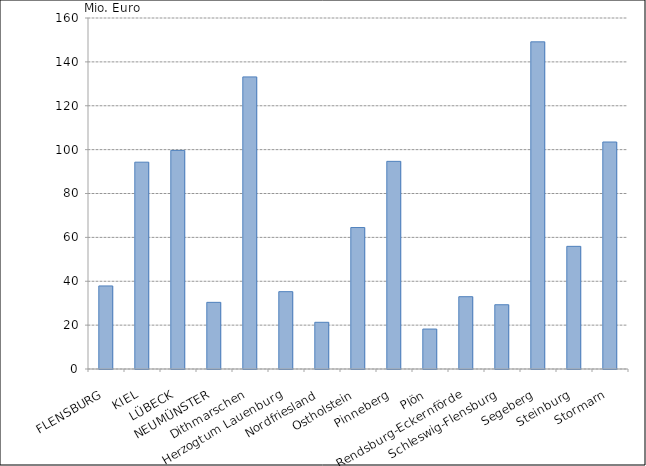
| Category | Series 0 |
|---|---|
| FLENSBURG | 37859.957 |
| KIEL | 94276.153 |
| LÜBECK | 99641.021 |
| NEUMÜNSTER | 30379.811 |
| Dithmarschen | 133143.259 |
| Herzogtum Lauenburg | 35254.259 |
| Nordfriesland | 21287.011 |
| Ostholstein | 64481.534 |
| Pinneberg | 94653.368 |
| Plön | 18211.416 |
| Rendsburg-Eckernförde | 32959.438 |
| Schleswig-Flensburg | 29293.558 |
| Segeberg | 149135.522 |
| Steinburg | 55906.239 |
| Stormarn | 103474.472 |